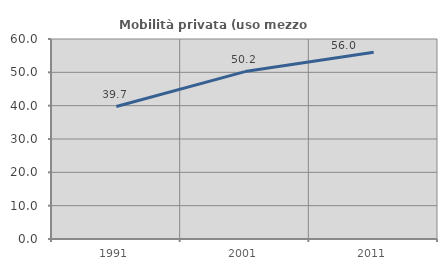
| Category | Mobilità privata (uso mezzo privato) |
|---|---|
| 1991.0 | 39.738 |
| 2001.0 | 50.218 |
| 2011.0 | 56.017 |